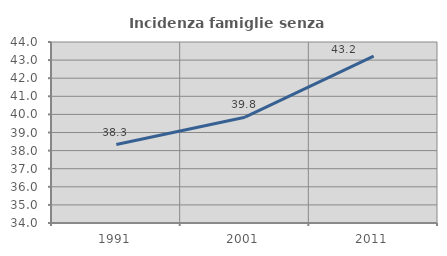
| Category | Incidenza famiglie senza nuclei |
|---|---|
| 1991.0 | 38.333 |
| 2001.0 | 39.844 |
| 2011.0 | 43.22 |